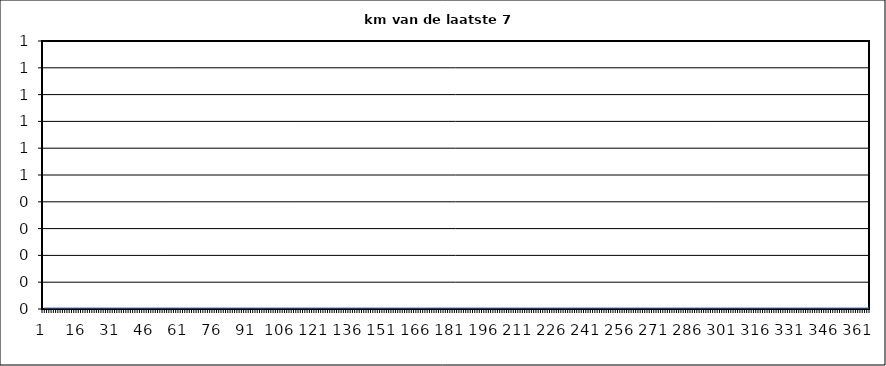
| Category | Series 0 |
|---|---|
| 0 | 0 |
| 1 | 0 |
| 2 | 0 |
| 3 | 0 |
| 4 | 0 |
| 5 | 0 |
| 6 | 0 |
| 7 | 0 |
| 8 | 0 |
| 9 | 0 |
| 10 | 0 |
| 11 | 0 |
| 12 | 0 |
| 13 | 0 |
| 14 | 0 |
| 15 | 0 |
| 16 | 0 |
| 17 | 0 |
| 18 | 0 |
| 19 | 0 |
| 20 | 0 |
| 21 | 0 |
| 22 | 0 |
| 23 | 0 |
| 24 | 0 |
| 25 | 0 |
| 26 | 0 |
| 27 | 0 |
| 28 | 0 |
| 29 | 0 |
| 30 | 0 |
| 31 | 0 |
| 32 | 0 |
| 33 | 0 |
| 34 | 0 |
| 35 | 0 |
| 36 | 0 |
| 37 | 0 |
| 38 | 0 |
| 39 | 0 |
| 40 | 0 |
| 41 | 0 |
| 42 | 0 |
| 43 | 0 |
| 44 | 0 |
| 45 | 0 |
| 46 | 0 |
| 47 | 0 |
| 48 | 0 |
| 49 | 0 |
| 50 | 0 |
| 51 | 0 |
| 52 | 0 |
| 53 | 0 |
| 54 | 0 |
| 55 | 0 |
| 56 | 0 |
| 57 | 0 |
| 58 | 0 |
| 59 | 0 |
| 60 | 0 |
| 61 | 0 |
| 62 | 0 |
| 63 | 0 |
| 64 | 0 |
| 65 | 0 |
| 66 | 0 |
| 67 | 0 |
| 68 | 0 |
| 69 | 0 |
| 70 | 0 |
| 71 | 0 |
| 72 | 0 |
| 73 | 0 |
| 74 | 0 |
| 75 | 0 |
| 76 | 0 |
| 77 | 0 |
| 78 | 0 |
| 79 | 0 |
| 80 | 0 |
| 81 | 0 |
| 82 | 0 |
| 83 | 0 |
| 84 | 0 |
| 85 | 0 |
| 86 | 0 |
| 87 | 0 |
| 88 | 0 |
| 89 | 0 |
| 90 | 0 |
| 91 | 0 |
| 92 | 0 |
| 93 | 0 |
| 94 | 0 |
| 95 | 0 |
| 96 | 0 |
| 97 | 0 |
| 98 | 0 |
| 99 | 0 |
| 100 | 0 |
| 101 | 0 |
| 102 | 0 |
| 103 | 0 |
| 104 | 0 |
| 105 | 0 |
| 106 | 0 |
| 107 | 0 |
| 108 | 0 |
| 109 | 0 |
| 110 | 0 |
| 111 | 0 |
| 112 | 0 |
| 113 | 0 |
| 114 | 0 |
| 115 | 0 |
| 116 | 0 |
| 117 | 0 |
| 118 | 0 |
| 119 | 0 |
| 120 | 0 |
| 121 | 0 |
| 122 | 0 |
| 123 | 0 |
| 124 | 0 |
| 125 | 0 |
| 126 | 0 |
| 127 | 0 |
| 128 | 0 |
| 129 | 0 |
| 130 | 0 |
| 131 | 0 |
| 132 | 0 |
| 133 | 0 |
| 134 | 0 |
| 135 | 0 |
| 136 | 0 |
| 137 | 0 |
| 138 | 0 |
| 139 | 0 |
| 140 | 0 |
| 141 | 0 |
| 142 | 0 |
| 143 | 0 |
| 144 | 0 |
| 145 | 0 |
| 146 | 0 |
| 147 | 0 |
| 148 | 0 |
| 149 | 0 |
| 150 | 0 |
| 151 | 0 |
| 152 | 0 |
| 153 | 0 |
| 154 | 0 |
| 155 | 0 |
| 156 | 0 |
| 157 | 0 |
| 158 | 0 |
| 159 | 0 |
| 160 | 0 |
| 161 | 0 |
| 162 | 0 |
| 163 | 0 |
| 164 | 0 |
| 165 | 0 |
| 166 | 0 |
| 167 | 0 |
| 168 | 0 |
| 169 | 0 |
| 170 | 0 |
| 171 | 0 |
| 172 | 0 |
| 173 | 0 |
| 174 | 0 |
| 175 | 0 |
| 176 | 0 |
| 177 | 0 |
| 178 | 0 |
| 179 | 0 |
| 180 | 0 |
| 181 | 0 |
| 182 | 0 |
| 183 | 0 |
| 184 | 0 |
| 185 | 0 |
| 186 | 0 |
| 187 | 0 |
| 188 | 0 |
| 189 | 0 |
| 190 | 0 |
| 191 | 0 |
| 192 | 0 |
| 193 | 0 |
| 194 | 0 |
| 195 | 0 |
| 196 | 0 |
| 197 | 0 |
| 198 | 0 |
| 199 | 0 |
| 200 | 0 |
| 201 | 0 |
| 202 | 0 |
| 203 | 0 |
| 204 | 0 |
| 205 | 0 |
| 206 | 0 |
| 207 | 0 |
| 208 | 0 |
| 209 | 0 |
| 210 | 0 |
| 211 | 0 |
| 212 | 0 |
| 213 | 0 |
| 214 | 0 |
| 215 | 0 |
| 216 | 0 |
| 217 | 0 |
| 218 | 0 |
| 219 | 0 |
| 220 | 0 |
| 221 | 0 |
| 222 | 0 |
| 223 | 0 |
| 224 | 0 |
| 225 | 0 |
| 226 | 0 |
| 227 | 0 |
| 228 | 0 |
| 229 | 0 |
| 230 | 0 |
| 231 | 0 |
| 232 | 0 |
| 233 | 0 |
| 234 | 0 |
| 235 | 0 |
| 236 | 0 |
| 237 | 0 |
| 238 | 0 |
| 239 | 0 |
| 240 | 0 |
| 241 | 0 |
| 242 | 0 |
| 243 | 0 |
| 244 | 0 |
| 245 | 0 |
| 246 | 0 |
| 247 | 0 |
| 248 | 0 |
| 249 | 0 |
| 250 | 0 |
| 251 | 0 |
| 252 | 0 |
| 253 | 0 |
| 254 | 0 |
| 255 | 0 |
| 256 | 0 |
| 257 | 0 |
| 258 | 0 |
| 259 | 0 |
| 260 | 0 |
| 261 | 0 |
| 262 | 0 |
| 263 | 0 |
| 264 | 0 |
| 265 | 0 |
| 266 | 0 |
| 267 | 0 |
| 268 | 0 |
| 269 | 0 |
| 270 | 0 |
| 271 | 0 |
| 272 | 0 |
| 273 | 0 |
| 274 | 0 |
| 275 | 0 |
| 276 | 0 |
| 277 | 0 |
| 278 | 0 |
| 279 | 0 |
| 280 | 0 |
| 281 | 0 |
| 282 | 0 |
| 283 | 0 |
| 284 | 0 |
| 285 | 0 |
| 286 | 0 |
| 287 | 0 |
| 288 | 0 |
| 289 | 0 |
| 290 | 0 |
| 291 | 0 |
| 292 | 0 |
| 293 | 0 |
| 294 | 0 |
| 295 | 0 |
| 296 | 0 |
| 297 | 0 |
| 298 | 0 |
| 299 | 0 |
| 300 | 0 |
| 301 | 0 |
| 302 | 0 |
| 303 | 0 |
| 304 | 0 |
| 305 | 0 |
| 306 | 0 |
| 307 | 0 |
| 308 | 0 |
| 309 | 0 |
| 310 | 0 |
| 311 | 0 |
| 312 | 0 |
| 313 | 0 |
| 314 | 0 |
| 315 | 0 |
| 316 | 0 |
| 317 | 0 |
| 318 | 0 |
| 319 | 0 |
| 320 | 0 |
| 321 | 0 |
| 322 | 0 |
| 323 | 0 |
| 324 | 0 |
| 325 | 0 |
| 326 | 0 |
| 327 | 0 |
| 328 | 0 |
| 329 | 0 |
| 330 | 0 |
| 331 | 0 |
| 332 | 0 |
| 333 | 0 |
| 334 | 0 |
| 335 | 0 |
| 336 | 0 |
| 337 | 0 |
| 338 | 0 |
| 339 | 0 |
| 340 | 0 |
| 341 | 0 |
| 342 | 0 |
| 343 | 0 |
| 344 | 0 |
| 345 | 0 |
| 346 | 0 |
| 347 | 0 |
| 348 | 0 |
| 349 | 0 |
| 350 | 0 |
| 351 | 0 |
| 352 | 0 |
| 353 | 0 |
| 354 | 0 |
| 355 | 0 |
| 356 | 0 |
| 357 | 0 |
| 358 | 0 |
| 359 | 0 |
| 360 | 0 |
| 361 | 0 |
| 362 | 0 |
| 363 | 0 |
| 364 | 0 |